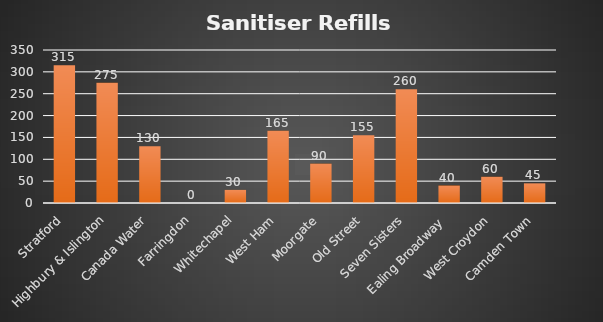
| Category | Litres |
|---|---|
| Stratford | 315 |
| Highbury & Islington | 275 |
| Canada Water | 130 |
| Farringdon | 0 |
| Whitechapel | 30 |
| West Ham | 165 |
| Moorgate | 90 |
| Old Street | 155 |
| Seven Sisters | 260 |
| Ealing Broadway  | 40 |
| West Croydon | 60 |
| Camden Town | 45 |